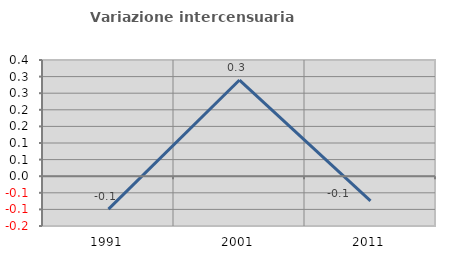
| Category | Variazione intercensuaria annua |
|---|---|
| 1991.0 | -0.099 |
| 2001.0 | 0.29 |
| 2011.0 | -0.074 |